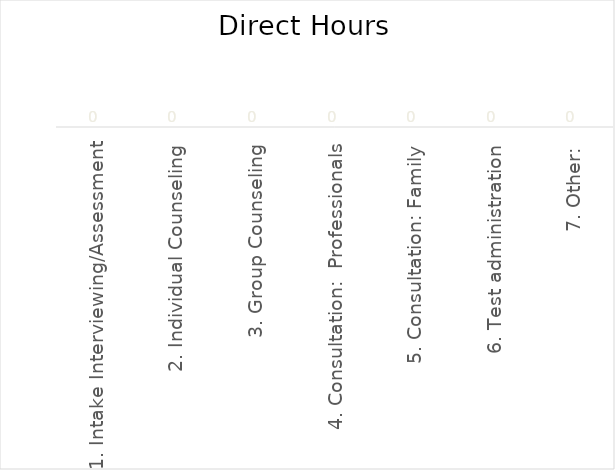
| Category | Series 0 |
|---|---|
| 1. Intake Interviewing/Assessment | 0 |
| 2. Individual Counseling | 0 |
| 3. Group Counseling | 0 |
| 4. Consultation:  Professionals | 0 |
| 5. Consultation: Family | 0 |
| 6. Test administration | 0 |
| 7. Other: | 0 |